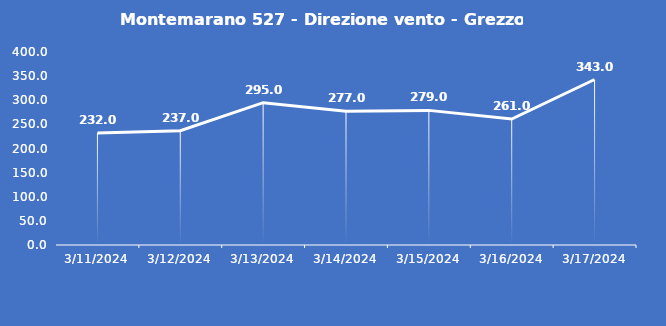
| Category | Montemarano 527 - Direzione vento - Grezzo (°N) |
|---|---|
| 3/11/24 | 232 |
| 3/12/24 | 237 |
| 3/13/24 | 295 |
| 3/14/24 | 277 |
| 3/15/24 | 279 |
| 3/16/24 | 261 |
| 3/17/24 | 343 |